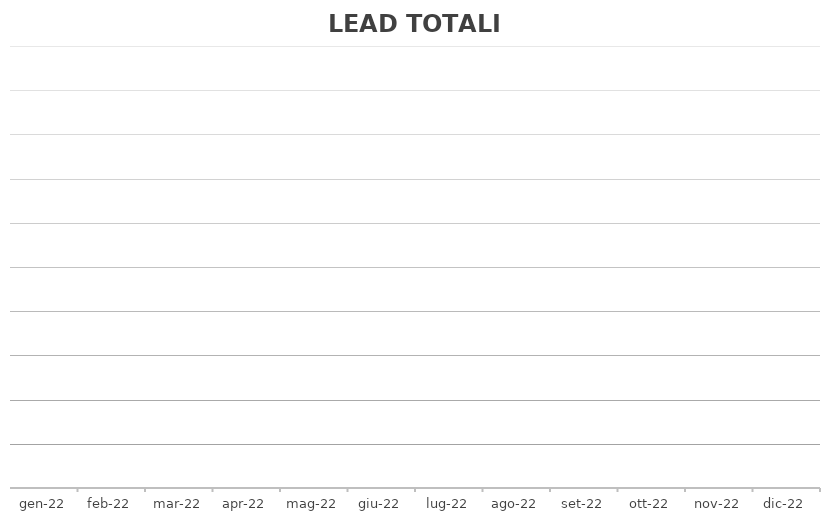
| Category | TOTALE |
|---|---|
| 2022-01-18 | 0 |
| 2022-02-18 | 0 |
| 2022-03-18 | 0 |
| 2022-04-18 | 0 |
| 2022-05-18 | 0 |
| 2022-06-18 | 0 |
| 2022-07-18 | 0 |
| 2022-08-18 | 0 |
| 2022-09-18 | 0 |
| 2022-10-18 | 0 |
| 2022-11-18 | 0 |
| 2022-12-18 | 0 |